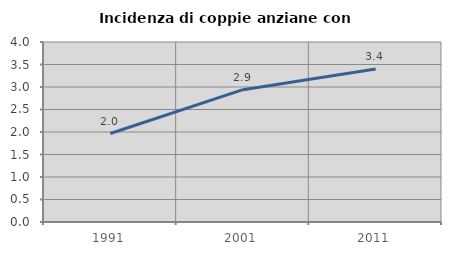
| Category | Incidenza di coppie anziane con figli |
|---|---|
| 1991.0 | 1.966 |
| 2001.0 | 2.94 |
| 2011.0 | 3.398 |